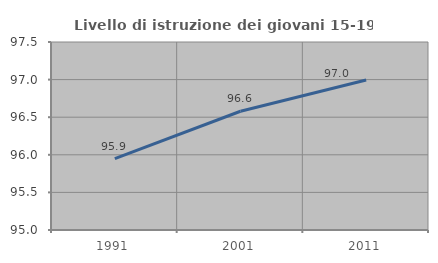
| Category | Livello di istruzione dei giovani 15-19 anni |
|---|---|
| 1991.0 | 95.949 |
| 2001.0 | 96.579 |
| 2011.0 | 96.995 |